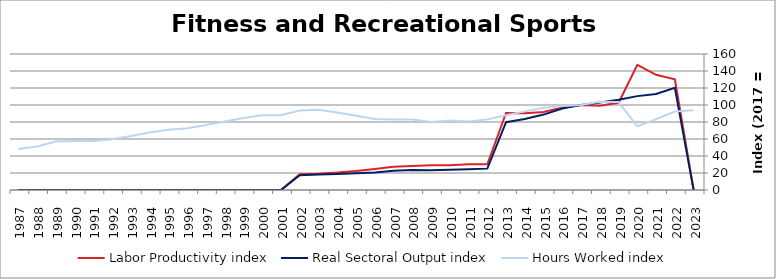
| Category | Labor Productivity index | Real Sectoral Output index | Hours Worked index |
|---|---|---|---|
| 2023.0 | 0 | 0 | 93.771 |
| 2022.0 | 130.261 | 120.318 | 92.367 |
| 2021.0 | 135.555 | 113.051 | 83.398 |
| 2020.0 | 147.234 | 110.438 | 75.009 |
| 2019.0 | 102.608 | 106.205 | 103.505 |
| 2018.0 | 99.162 | 102.843 | 103.712 |
| 2017.0 | 100 | 100 | 100 |
| 2016.0 | 97.133 | 95.928 | 98.76 |
| 2015.0 | 91.753 | 88.714 | 96.688 |
| 2014.0 | 90.216 | 83.443 | 92.492 |
| 2013.0 | 90.584 | 79.76 | 88.051 |
| 2012.0 | 30.241 | 25.124 | 83.081 |
| 2011.0 | 30.224 | 24.388 | 80.69 |
| 2010.0 | 29.011 | 23.736 | 81.818 |
| 2009.0 | 29.16 | 23.29 | 79.869 |
| 2008.0 | 28.326 | 23.502 | 82.97 |
| 2007.0 | 27.223 | 22.591 | 82.987 |
| 2006.0 | 24.822 | 20.704 | 83.412 |
| 2005.0 | 22.408 | 19.586 | 87.404 |
| 2004.0 | 20.582 | 18.761 | 91.154 |
| 2003.0 | 19.247 | 18.171 | 94.413 |
| 2002.0 | 18.505 | 17.286 | 93.416 |
| 2001.0 | 0 | 0 | 87.901 |
| 2000.0 | 0 | 0 | 87.891 |
| 1999.0 | 0 | 0 | 84.82 |
| 1998.0 | 0 | 0 | 80.694 |
| 1997.0 | 0 | 0 | 76.427 |
| 1996.0 | 0 | 0 | 72.607 |
| 1995.0 | 0 | 0 | 70.894 |
| 1994.0 | 0 | 0 | 67.678 |
| 1993.0 | 0 | 0 | 63.589 |
| 1992.0 | 0 | 0 | 59.601 |
| 1991.0 | 0 | 0 | 57.543 |
| 1990.0 | 0 | 0 | 57.575 |
| 1989.0 | 0 | 0 | 57.153 |
| 1988.0 | 0 | 0 | 51.127 |
| 1987.0 | 0 | 0 | 48.111 |